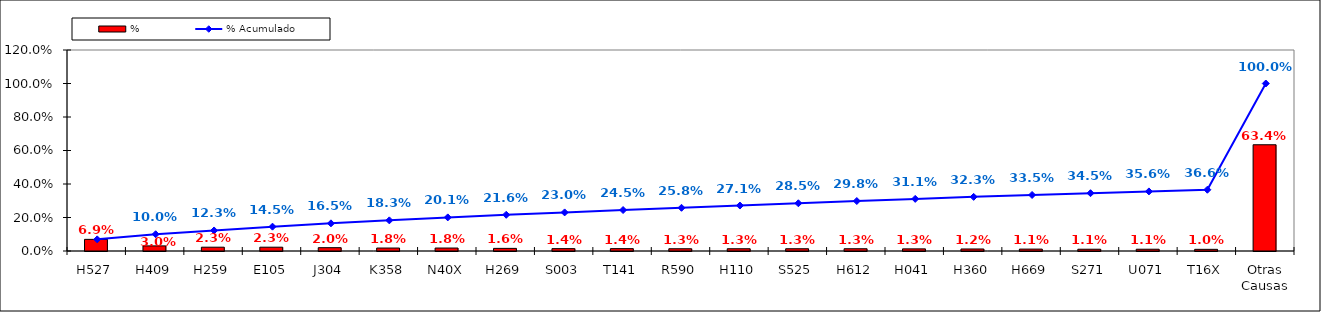
| Category | % |
|---|---|
| H527 | 0.069 |
| H409 | 0.03 |
| H259 | 0.023 |
| E105 | 0.023 |
| J304 | 0.02 |
| K358 | 0.018 |
| N40X | 0.018 |
| H269 | 0.016 |
| S003 | 0.014 |
| T141 | 0.014 |
| R590 | 0.013 |
| H110 | 0.013 |
| S525 | 0.013 |
| H612 | 0.013 |
| H041 | 0.013 |
| H360 | 0.012 |
| H669 | 0.011 |
| S271 | 0.011 |
| U071 | 0.011 |
| T16X | 0.01 |
| Otras Causas | 0.634 |